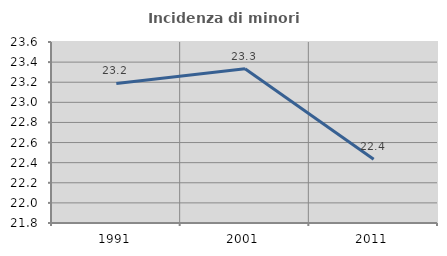
| Category | Incidenza di minori stranieri |
|---|---|
| 1991.0 | 23.188 |
| 2001.0 | 23.333 |
| 2011.0 | 22.434 |